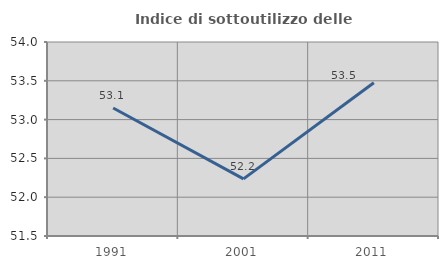
| Category | Indice di sottoutilizzo delle abitazioni  |
|---|---|
| 1991.0 | 53.149 |
| 2001.0 | 52.236 |
| 2011.0 | 53.474 |